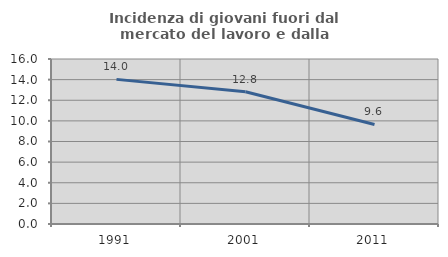
| Category | Incidenza di giovani fuori dal mercato del lavoro e dalla formazione  |
|---|---|
| 1991.0 | 14.024 |
| 2001.0 | 12.821 |
| 2011.0 | 9.649 |